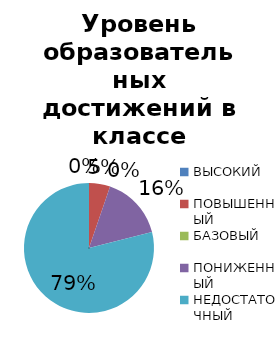
| Category | Series 0 |
|---|---|
| ВЫСОКИЙ | 0 |
| ПОВЫШЕННЫЙ | 7.143 |
| БАЗОВЫЙ | 0 |
| ПОНИЖЕННЫЙ | 21.429 |
| НЕДОСТАТОЧНЫЙ | 107.143 |